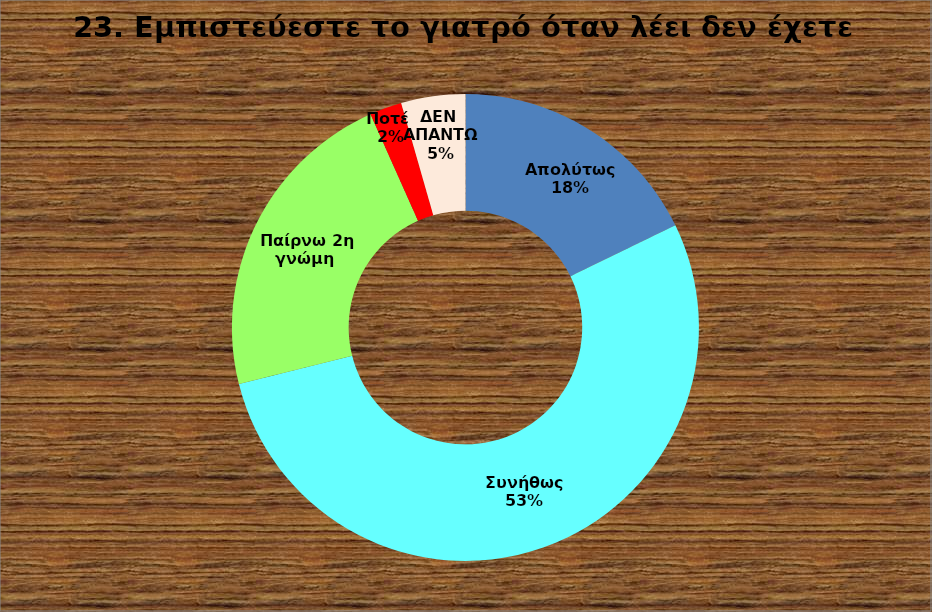
| Category | Series 0 |
|---|---|
| Απολύτως  | 0.178 |
| Συνήθως  | 0.533 |
| Παίρνω 2η γνώμη  | 0.222 |
| Σπάνια  | 0 |
| Ποτέ  | 0.022 |
| ΔΕΝ ΑΠΑΝΤΩ | 0.044 |